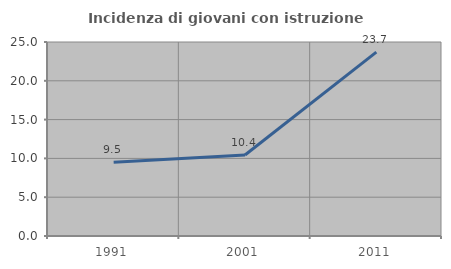
| Category | Incidenza di giovani con istruzione universitaria |
|---|---|
| 1991.0 | 9.492 |
| 2001.0 | 10.443 |
| 2011.0 | 23.695 |